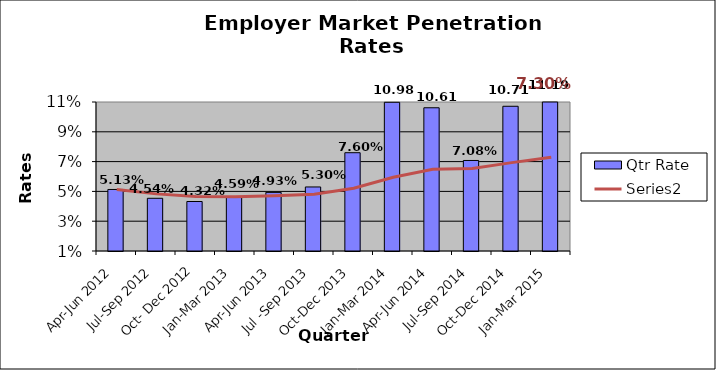
| Category | Qtr Rate |
|---|---|
| Apr-Jun 2012 | 0.051 |
| Jul-Sep 2012 | 0.045 |
| Oct- Dec 2012 | 0.043 |
| Jan-Mar 2013 | 0.046 |
| Apr-Jun 2013 | 0.049 |
| Jul -Sep 2013 | 0.053 |
| Oct-Dec 2013 | 0.076 |
| Jan-Mar 2014 | 0.11 |
| Apr-Jun 2014 | 0.106 |
| Jul-Sep 2014 | 0.071 |
| Oct-Dec 2014 | 0.107 |
| Jan-Mar 2015 | 0.112 |